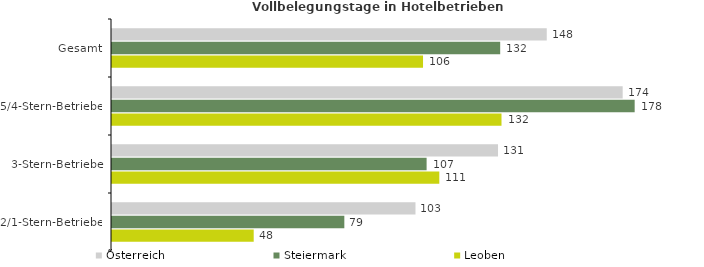
| Category | Österreich | Steiermark | Leoben |
|---|---|---|---|
| Gesamt | 147.876 | 132.038 | 105.793 |
| 5/4-Stern-Betriebe | 173.697 | 177.779 | 132.485 |
| 3-Stern-Betriebe | 131.294 | 107.011 | 111.328 |
| 2/1-Stern-Betriebe | 103.222 | 79.024 | 48.199 |